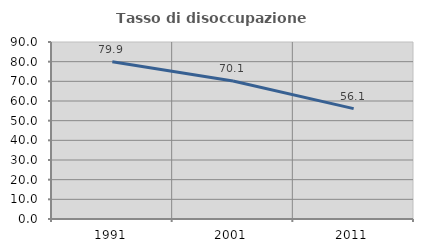
| Category | Tasso di disoccupazione giovanile  |
|---|---|
| 1991.0 | 79.922 |
| 2001.0 | 70.13 |
| 2011.0 | 56.118 |